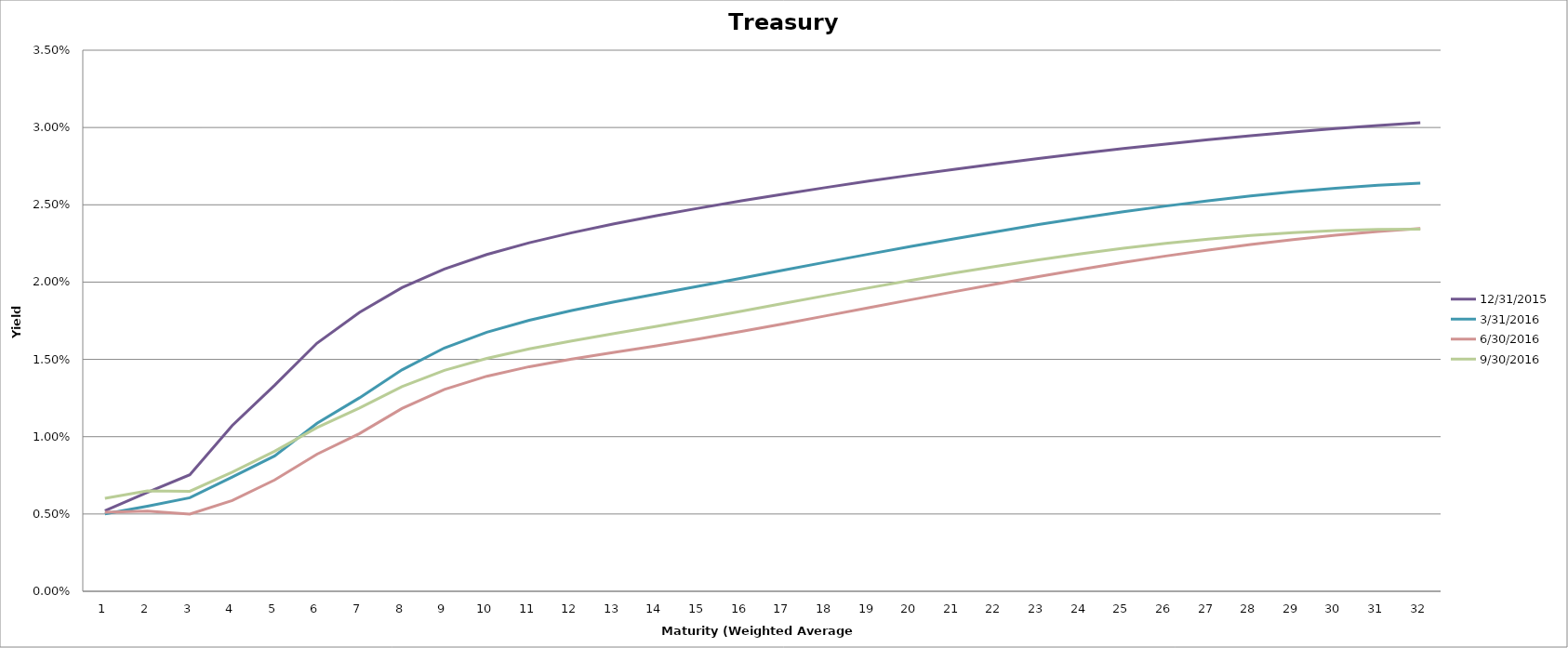
| Category | 12/31/2015 | 3/31/2016 | 6/30/2016 | 9/30/2016 |
|---|---|---|---|---|
| 0 | 0.005 | 0.005 | 0.005 | 0.006 |
| 1 | 0.006 | 0.006 | 0.005 | 0.007 |
| 2 | 0.008 | 0.006 | 0.005 | 0.006 |
| 3 | 0.011 | 0.007 | 0.006 | 0.008 |
| 4 | 0.013 | 0.009 | 0.007 | 0.009 |
| 5 | 0.016 | 0.011 | 0.009 | 0.011 |
| 6 | 0.018 | 0.013 | 0.01 | 0.012 |
| 7 | 0.02 | 0.014 | 0.012 | 0.013 |
| 8 | 0.021 | 0.016 | 0.013 | 0.014 |
| 9 | 0.022 | 0.017 | 0.014 | 0.015 |
| 10 | 0.023 | 0.018 | 0.015 | 0.016 |
| 11 | 0.023 | 0.018 | 0.015 | 0.016 |
| 12 | 0.024 | 0.019 | 0.015 | 0.017 |
| 13 | 0.024 | 0.019 | 0.016 | 0.017 |
| 14 | 0.025 | 0.02 | 0.016 | 0.018 |
| 15 | 0.025 | 0.02 | 0.017 | 0.018 |
| 16 | 0.026 | 0.021 | 0.017 | 0.019 |
| 17 | 0.026 | 0.021 | 0.018 | 0.019 |
| 18 | 0.027 | 0.022 | 0.018 | 0.02 |
| 19 | 0.027 | 0.022 | 0.019 | 0.02 |
| 20 | 0.027 | 0.023 | 0.019 | 0.021 |
| 21 | 0.028 | 0.023 | 0.02 | 0.021 |
| 22 | 0.028 | 0.024 | 0.02 | 0.021 |
| 23 | 0.028 | 0.024 | 0.021 | 0.022 |
| 24 | 0.029 | 0.025 | 0.021 | 0.022 |
| 25 | 0.029 | 0.025 | 0.022 | 0.023 |
| 26 | 0.029 | 0.025 | 0.022 | 0.023 |
| 27 | 0.029 | 0.026 | 0.022 | 0.023 |
| 28 | 0.03 | 0.026 | 0.023 | 0.023 |
| 29 | 0.03 | 0.026 | 0.023 | 0.023 |
| 30 | 0.03 | 0.026 | 0.023 | 0.023 |
| 31 | 0.03 | 0.026 | 0.023 | 0.023 |